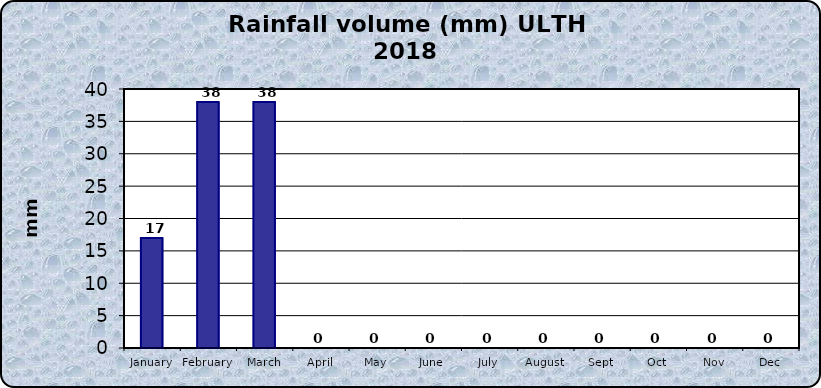
| Category | Series 0 |
|---|---|
| January | 17 |
| February | 38 |
| March | 38 |
| April | 0 |
| May | 0 |
| June | 0 |
| July | 0 |
| August | 0 |
| Sept | 0 |
| Oct | 0 |
| Nov | 0 |
| Dec | 0 |